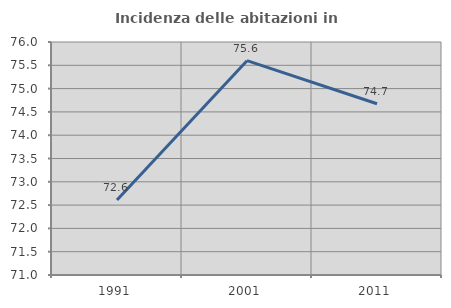
| Category | Incidenza delle abitazioni in proprietà  |
|---|---|
| 1991.0 | 72.611 |
| 2001.0 | 75.599 |
| 2011.0 | 74.675 |